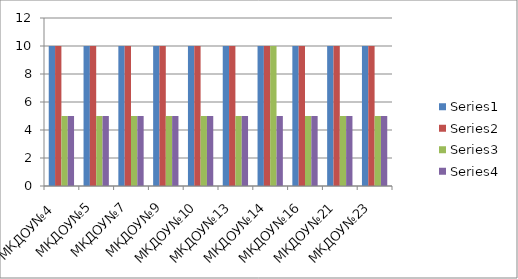
| Category | Series 0 | Series 1 | Series 2 | Series 3 |
|---|---|---|---|---|
| МКДОУ№4  | 10 | 10 | 5 | 5 |
| МКДОУ№5 | 10 | 10 | 5 | 5 |
| МКДОУ№7 | 10 | 10 | 5 | 5 |
| МКДОУ№9 | 10 | 10 | 5 | 5 |
| МКДОУ№10 | 10 | 10 | 5 | 5 |
| МКДОУ№13 | 10 | 10 | 5 | 5 |
| МКДОУ№14 | 10 | 10 | 10 | 5 |
| МКДОУ№16 | 10 | 10 | 5 | 5 |
| МКДОУ№21 | 10 | 10 | 5 | 5 |
| МКДОУ№23 | 10 | 10 | 5 | 5 |